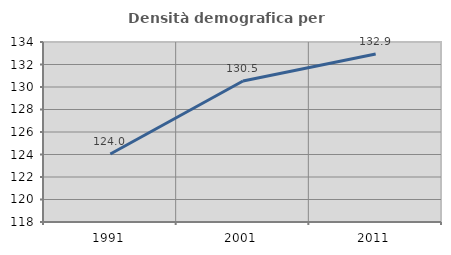
| Category | Densità demografica |
|---|---|
| 1991.0 | 124.048 |
| 2001.0 | 130.533 |
| 2011.0 | 132.932 |